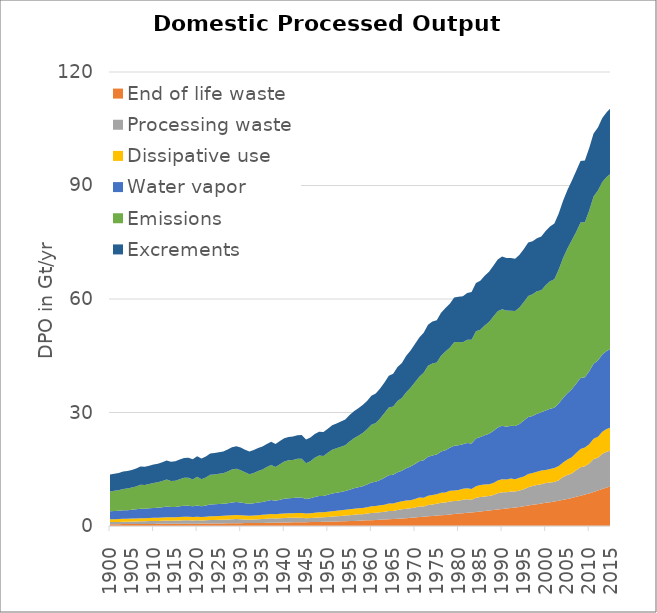
| Category | End of life waste | Processing waste | Dissipative use | Water vapor | Emissions | Excrements |
|---|---|---|---|---|---|---|
| 1900.0 | 0.487 | 0.537 | 0.756 | 2.105 | 5.25 | 4.494 |
| 1901.0 | 0.491 | 0.556 | 0.765 | 2.141 | 5.34 | 4.533 |
| 1902.0 | 0.495 | 0.573 | 0.777 | 2.169 | 5.419 | 4.571 |
| 1903.0 | 0.502 | 0.6 | 0.785 | 2.247 | 5.639 | 4.609 |
| 1904.0 | 0.507 | 0.616 | 0.792 | 2.271 | 5.7 | 4.648 |
| 1905.0 | 0.515 | 0.649 | 0.801 | 2.326 | 5.855 | 4.686 |
| 1906.0 | 0.521 | 0.67 | 0.809 | 2.402 | 6.064 | 4.725 |
| 1907.0 | 0.533 | 0.712 | 0.82 | 2.506 | 6.362 | 4.763 |
| 1908.0 | 0.535 | 0.714 | 0.83 | 2.479 | 6.275 | 4.802 |
| 1909.0 | 0.545 | 0.745 | 0.839 | 2.536 | 6.424 | 4.84 |
| 1910.0 | 0.555 | 0.777 | 0.848 | 2.594 | 6.587 | 4.879 |
| 1911.0 | 0.564 | 0.791 | 0.857 | 2.635 | 6.694 | 4.933 |
| 1912.0 | 0.572 | 0.828 | 0.866 | 2.707 | 6.893 | 4.988 |
| 1913.0 | 0.582 | 0.867 | 0.876 | 2.802 | 7.16 | 5.043 |
| 1914.0 | 0.588 | 0.82 | 0.881 | 2.716 | 6.889 | 5.098 |
| 1915.0 | 0.597 | 0.831 | 0.887 | 2.727 | 6.91 | 5.153 |
| 1916.0 | 0.604 | 0.881 | 0.898 | 2.826 | 7.175 | 5.207 |
| 1917.0 | 0.611 | 0.903 | 0.908 | 2.904 | 7.395 | 5.262 |
| 1918.0 | 0.616 | 0.897 | 0.916 | 2.905 | 7.39 | 5.317 |
| 1919.0 | 0.621 | 0.844 | 0.926 | 2.802 | 7.071 | 5.372 |
| 1920.0 | 0.625 | 0.888 | 0.938 | 2.972 | 7.563 | 5.427 |
| 1921.0 | 0.632 | 0.81 | 0.942 | 2.836 | 7.157 | 5.483 |
| 1922.0 | 0.644 | 0.869 | 0.957 | 2.928 | 7.418 | 5.538 |
| 1923.0 | 0.655 | 0.936 | 0.967 | 3.103 | 7.895 | 5.594 |
| 1924.0 | 0.663 | 0.95 | 0.986 | 3.119 | 7.919 | 5.65 |
| 1925.0 | 0.678 | 0.984 | 0.997 | 3.152 | 7.999 | 5.706 |
| 1926.0 | 0.689 | 0.992 | 1.008 | 3.178 | 8.053 | 5.762 |
| 1927.0 | 0.703 | 1.024 | 1.018 | 3.288 | 8.353 | 5.817 |
| 1928.0 | 0.72 | 1.07 | 1.027 | 3.42 | 8.721 | 5.873 |
| 1929.0 | 0.736 | 1.103 | 1.036 | 3.463 | 8.789 | 5.929 |
| 1930.0 | 0.748 | 1.055 | 1.045 | 3.379 | 8.523 | 5.985 |
| 1931.0 | 0.762 | 0.971 | 1.047 | 3.251 | 8.152 | 6.003 |
| 1932.0 | 0.773 | 0.88 | 1.061 | 3.146 | 7.843 | 6.02 |
| 1933.0 | 0.786 | 0.906 | 1.08 | 3.217 | 8.035 | 6.037 |
| 1934.0 | 0.805 | 0.972 | 1.095 | 3.336 | 8.358 | 6.055 |
| 1935.0 | 0.821 | 1.016 | 1.111 | 3.417 | 8.581 | 6.072 |
| 1936.0 | 0.841 | 1.082 | 1.131 | 3.568 | 8.964 | 6.09 |
| 1937.0 | 0.862 | 1.174 | 1.141 | 3.689 | 9.291 | 6.107 |
| 1938.0 | 0.877 | 1.109 | 1.144 | 3.554 | 8.893 | 6.124 |
| 1939.0 | 0.899 | 1.154 | 1.17 | 3.727 | 9.38 | 6.142 |
| 1940.0 | 0.921 | 1.216 | 1.189 | 3.883 | 9.811 | 6.159 |
| 1941.0 | 0.94 | 1.243 | 1.208 | 3.954 | 10.002 | 6.177 |
| 1942.0 | 0.963 | 1.214 | 1.221 | 3.984 | 10.058 | 6.194 |
| 1943.0 | 0.982 | 1.231 | 1.238 | 4.069 | 10.249 | 6.211 |
| 1944.0 | 1 | 1.165 | 1.254 | 4.1 | 10.288 | 6.229 |
| 1945.0 | 1.011 | 1.062 | 1.263 | 3.831 | 9.449 | 6.246 |
| 1946.0 | 1.027 | 1.059 | 1.285 | 3.946 | 9.779 | 6.264 |
| 1947.0 | 1.051 | 1.142 | 1.307 | 4.167 | 10.371 | 6.281 |
| 1948.0 | 1.074 | 1.196 | 1.337 | 4.307 | 10.71 | 6.298 |
| 1949.0 | 1.098 | 1.189 | 1.347 | 4.283 | 10.592 | 6.316 |
| 1950.0 | 1.126 | 1.255 | 1.368 | 4.497 | 11.118 | 6.333 |
| 1951.0 | 1.161 | 1.33 | 1.407 | 4.697 | 11.574 | 6.458 |
| 1952.0 | 1.194 | 1.376 | 1.436 | 4.781 | 11.746 | 6.584 |
| 1953.0 | 1.227 | 1.442 | 1.47 | 4.86 | 11.915 | 6.712 |
| 1954.0 | 1.27 | 1.51 | 1.503 | 4.942 | 12.092 | 6.84 |
| 1955.0 | 1.302 | 1.568 | 1.547 | 5.181 | 12.741 | 6.97 |
| 1956.0 | 1.348 | 1.648 | 1.583 | 5.383 | 13.235 | 7.101 |
| 1957.0 | 1.394 | 1.711 | 1.617 | 5.546 | 13.597 | 7.234 |
| 1958.0 | 1.436 | 1.696 | 1.65 | 5.745 | 14.058 | 7.367 |
| 1959.0 | 1.489 | 1.784 | 1.699 | 5.988 | 14.602 | 7.502 |
| 1960.0 | 1.543 | 1.918 | 1.727 | 6.284 | 15.312 | 7.639 |
| 1961.0 | 1.593 | 1.934 | 1.757 | 6.41 | 15.535 | 7.766 |
| 1962.0 | 1.649 | 2.006 | 1.802 | 6.723 | 16.247 | 7.937 |
| 1963.0 | 1.713 | 2.03 | 1.902 | 7.098 | 17.146 | 8.067 |
| 1964.0 | 1.775 | 2.204 | 1.952 | 7.455 | 17.961 | 8.371 |
| 1965.0 | 1.851 | 2.144 | 1.971 | 7.555 | 18.05 | 8.699 |
| 1966.0 | 1.926 | 2.298 | 2.062 | 7.911 | 18.821 | 9.036 |
| 1967.0 | 1.994 | 2.401 | 2.131 | 8.109 | 19.169 | 9.307 |
| 1968.0 | 2.079 | 2.482 | 2.159 | 8.533 | 20.122 | 9.599 |
| 1969.0 | 2.177 | 2.484 | 2.171 | 8.89 | 20.805 | 9.844 |
| 1970.0 | 2.267 | 2.641 | 2.23 | 9.245 | 21.621 | 10.084 |
| 1971.0 | 2.351 | 2.797 | 2.38 | 9.561 | 22.364 | 10.363 |
| 1972.0 | 2.44 | 2.697 | 2.344 | 9.898 | 23.104 | 10.614 |
| 1973.0 | 2.547 | 2.979 | 2.459 | 10.3 | 24.077 | 10.841 |
| 1974.0 | 2.649 | 3.063 | 2.479 | 10.43 | 24.318 | 11.103 |
| 1975.0 | 2.751 | 3.154 | 2.507 | 10.457 | 24.354 | 11.154 |
| 1976.0 | 2.84 | 3.325 | 2.608 | 10.904 | 25.346 | 11.355 |
| 1977.0 | 2.94 | 3.282 | 2.634 | 11.198 | 26.079 | 11.508 |
| 1978.0 | 3.053 | 3.433 | 2.817 | 11.397 | 26.407 | 11.646 |
| 1979.0 | 3.177 | 3.411 | 2.787 | 11.83 | 27.362 | 11.852 |
| 1980.0 | 3.282 | 3.418 | 2.792 | 11.869 | 27.259 | 11.992 |
| 1981.0 | 3.387 | 3.563 | 2.887 | 11.804 | 26.928 | 12.163 |
| 1982.0 | 3.493 | 3.578 | 2.896 | 12 | 27.291 | 12.335 |
| 1983.0 | 3.59 | 3.323 | 2.845 | 12.079 | 27.417 | 12.576 |
| 1984.0 | 3.709 | 3.753 | 3.065 | 12.615 | 28.33 | 12.732 |
| 1985.0 | 3.828 | 3.84 | 3.172 | 12.705 | 28.333 | 12.965 |
| 1986.0 | 3.945 | 3.856 | 3.155 | 13.002 | 29.041 | 13.176 |
| 1987.0 | 4.071 | 3.856 | 3.13 | 13.313 | 29.522 | 13.33 |
| 1988.0 | 4.208 | 3.985 | 3.178 | 13.734 | 30.253 | 13.453 |
| 1989.0 | 4.353 | 4.307 | 3.359 | 14.009 | 30.734 | 13.711 |
| 1990.0 | 4.492 | 4.447 | 3.392 | 14.146 | 30.843 | 13.931 |
| 1991.0 | 4.619 | 4.291 | 3.349 | 14.003 | 30.677 | 13.926 |
| 1992.0 | 4.745 | 4.373 | 3.437 | 13.969 | 30.377 | 13.905 |
| 1993.0 | 4.883 | 4.207 | 3.258 | 14.074 | 30.399 | 13.802 |
| 1994.0 | 5.041 | 4.328 | 3.352 | 14.243 | 30.79 | 13.946 |
| 1995.0 | 5.234 | 4.476 | 3.366 | 14.809 | 31.352 | 13.978 |
| 1996.0 | 5.405 | 4.813 | 3.526 | 15.086 | 31.95 | 14.126 |
| 1997.0 | 5.586 | 4.984 | 3.451 | 15.072 | 32.141 | 14.008 |
| 1998.0 | 5.767 | 5.088 | 3.464 | 15.36 | 32.359 | 13.998 |
| 1999.0 | 5.941 | 5.126 | 3.6 | 15.401 | 32.249 | 14.19 |
| 2000.0 | 6.122 | 5.231 | 3.44 | 15.76 | 33.063 | 14.36 |
| 2001.0 | 6.302 | 5.221 | 3.572 | 15.917 | 33.707 | 14.475 |
| 2002.0 | 6.505 | 5.151 | 3.661 | 15.946 | 33.969 | 14.695 |
| 2003.0 | 6.704 | 5.391 | 3.737 | 16.556 | 35.416 | 14.806 |
| 2004.0 | 6.932 | 6.037 | 3.833 | 17.035 | 36.981 | 15.18 |
| 2005.0 | 7.157 | 6.298 | 4.149 | 17.516 | 38.213 | 15.506 |
| 2006.0 | 7.417 | 6.485 | 4.274 | 17.977 | 39.352 | 15.784 |
| 2007.0 | 7.723 | 6.982 | 4.602 | 18.298 | 40.105 | 16.111 |
| 2008.0 | 8.008 | 7.499 | 4.873 | 18.759 | 41.052 | 16.305 |
| 2009.0 | 8.312 | 7.465 | 4.995 | 18.569 | 40.926 | 16.316 |
| 2010.0 | 8.62 | 7.895 | 5.103 | 19.316 | 42.489 | 16.499 |
| 2011.0 | 9.007 | 8.697 | 5.343 | 19.82 | 44.198 | 16.666 |
| 2012.0 | 9.377 | 8.636 | 5.553 | 20.181 | 44.904 | 16.69 |
| 2013.0 | 9.763 | 9.333 | 5.821 | 20.441 | 45.584 | 16.898 |
| 2014.0 | 10.161 | 9.494 | 6.016 | 20.586 | 45.96 | 17.17 |
| 2015.0 | 10.524 | 9.447 | 6.124 | 20.782 | 46.283 | 17.391 |